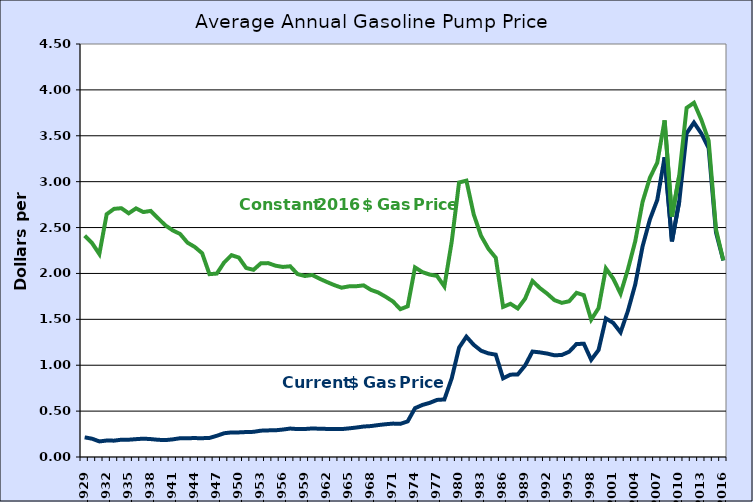
| Category | Retail Gasoline Price (current dollars/gallon) | Retail Gasoline Price 
(Constant 2016 dollars/gallon)  |
|---|---|---|
| 1929.0 | 0.214 | 2.412 |
| 1930.0 | 0.199 | 2.332 |
| 1931.0 | 0.17 | 2.212 |
| 1932.0 | 0.179 | 2.646 |
| 1933.0 | 0.178 | 2.704 |
| 1934.0 | 0.188 | 2.711 |
| 1935.0 | 0.188 | 2.655 |
| 1936.0 | 0.194 | 2.709 |
| 1937.0 | 0.2 | 2.669 |
| 1938.0 | 0.195 | 2.681 |
| 1939.0 | 0.188 | 2.601 |
| 1940.0 | 0.184 | 2.523 |
| 1941.0 | 0.192 | 2.469 |
| 1942.0 | 0.204 | 2.43 |
| 1943.0 | 0.205 | 2.336 |
| 1944.0 | 0.206 | 2.288 |
| 1945.0 | 0.205 | 2.221 |
| 1946.0 | 0.208 | 1.992 |
| 1947.0 | 0.231 | 1.999 |
| 1948.0 | 0.259 | 2.12 |
| 1949.0 | 0.268 | 2.199 |
| 1950.0 | 0.268 | 2.173 |
| 1951.0 | 0.272 | 2.06 |
| 1952.0 | 0.274 | 2.04 |
| 1953.0 | 0.287 | 2.11 |
| 1954.0 | 0.29 | 2.113 |
| 1955.0 | 0.291 | 2.084 |
| 1956.0 | 0.299 | 2.071 |
| 1957.0 | 0.31 | 2.078 |
| 1958.0 | 0.304 | 1.993 |
| 1959.0 | 0.305 | 1.972 |
| 1960.0 | 0.311 | 1.983 |
| 1961.0 | 0.308 | 1.943 |
| 1962.0 | 0.306 | 1.907 |
| 1963.0 | 0.304 | 1.873 |
| 1964.0 | 0.304 | 1.845 |
| 1965.0 | 0.312 | 1.859 |
| 1966.0 | 0.321 | 1.861 |
| 1967.0 | 0.332 | 1.87 |
| 1968.0 | 0.337 | 1.821 |
| 1969.0 | 0.348 | 1.792 |
| 1970.0 | 0.357 | 1.746 |
| 1971.0 | 0.364 | 1.694 |
| 1972.0 | 0.361 | 1.611 |
| 1973.0 | 0.388 | 1.642 |
| 1974.0 | 0.532 | 2.066 |
| 1975.0 | 0.567 | 2.015 |
| 1976.0 | 0.59 | 1.988 |
| 1977.0 | 0.622 | 1.973 |
| 1978.0 | 0.627 | 1.858 |
| 1979.0 | 0.857 | 2.346 |
| 1980.0 | 1.191 | 2.991 |
| 1981.0 | 1.311 | 3.011 |
| 1982.0 | 1.222 | 2.643 |
| 1983.0 | 1.158 | 2.409 |
| 1984.0 | 1.129 | 2.268 |
| 1985.0 | 1.115 | 2.171 |
| 1986.0 | 0.857 | 1.636 |
| 1987.0 | 0.897 | 1.669 |
| 1988.0 | 0.9 | 1.618 |
| 1989.0 | 0.997 | 1.726 |
| 1990.0 | 1.149 | 1.918 |
| 1991.0 | 1.14 | 1.841 |
| 1992.0 | 1.127 | 1.78 |
| 1993.0 | 1.108 | 1.709 |
| 1994.0 | 1.112 | 1.68 |
| 1995.0 | 1.147 | 1.697 |
| 1996.0 | 1.231 | 1.789 |
| 1997.0 | 1.234 | 1.763 |
| 1998.0 | 1.059 | 1.497 |
| 1999.0 | 1.165 | 1.622 |
| 2000.0 | 1.51 | 2.055 |
| 2001.0 | 1.461 | 1.944 |
| 2002.0 | 1.358 | 1.78 |
| 2003.0 | 1.591 | 2.044 |
| 2004.0 | 1.88 | 2.351 |
| 2005.0 | 2.295 | 2.78 |
| 2006.0 | 2.589 | 3.043 |
| 2007.0 | 2.801 | 3.207 |
| 2008.0 | 3.266 | 3.667 |
| 2009.0 | 2.35 | 2.619 |
| 2010.0 | 2.788 | 3.07 |
| 2011.0 | 3.527 | 3.805 |
| 2012.0 | 3.644 | 3.86 |
| 2013.0 | 3.526 | 3.675 |
| 2014.0 | 3.367 | 3.448 |
| 2015.0 | 2.448 | 2.48 |
| 2016.0 | 2.142 | 2.142 |